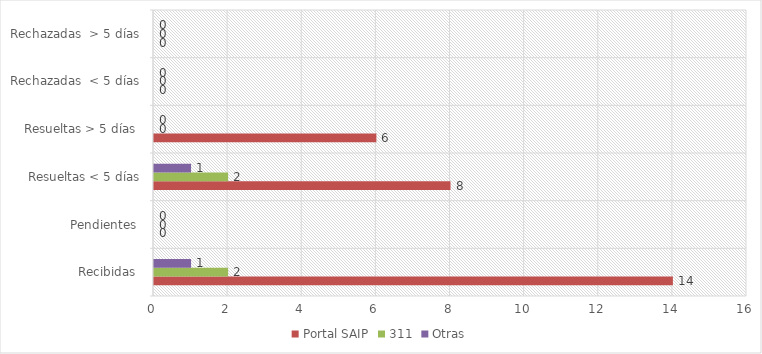
| Category | Portal SAIP | 311 | Otras |
|---|---|---|---|
| Recibidas  | 14 | 2 | 1 |
| Pendientes  | 0 | 0 | 0 |
| Resueltas < 5 días | 8 | 2 | 1 |
| Resueltas > 5 días  | 6 | 0 | 0 |
| Rechazadas  < 5 días | 0 | 0 | 0 |
| Rechazadas  > 5 días | 0 | 0 | 0 |